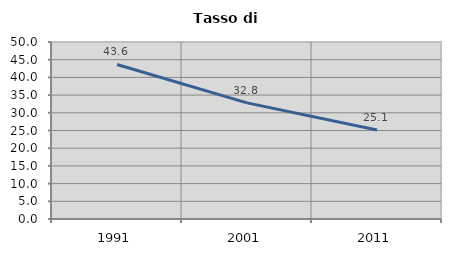
| Category | Tasso di disoccupazione   |
|---|---|
| 1991.0 | 43.65 |
| 2001.0 | 32.802 |
| 2011.0 | 25.12 |